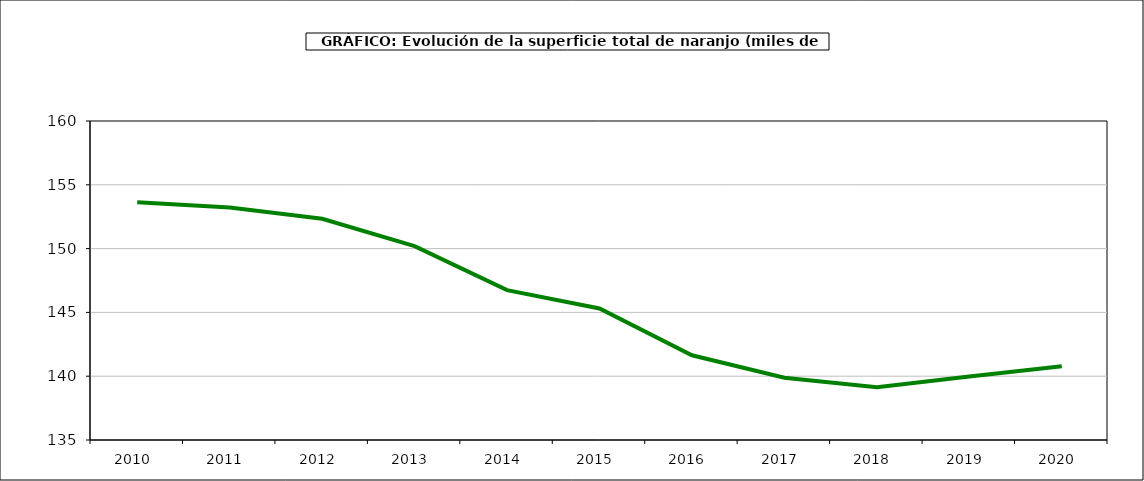
| Category | superficie |
|---|---|
| 2010.0 | 153.631 |
| 2011.0 | 153.222 |
| 2012.0 | 152.34 |
| 2013.0 | 150.198 |
| 2014.0 | 146.742 |
| 2015.0 | 145.306 |
| 2016.0 | 141.639 |
| 2017.0 | 139.878 |
| 2018.0 | 139.132 |
| 2019.0 | 139.971 |
| 2020.0 | 140.786 |